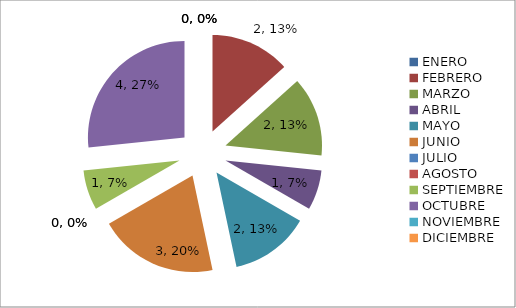
| Category | Series 0 |
|---|---|
| ENERO | 0 |
| FEBRERO | 2 |
| MARZO | 2 |
| ABRIL | 1 |
| MAYO | 2 |
| JUNIO | 3 |
| JULIO | 0 |
| AGOSTO | 0 |
| SEPTIEMBRE | 1 |
| OCTUBRE | 4 |
| NOVIEMBRE | 0 |
| DICIEMBRE | 0 |